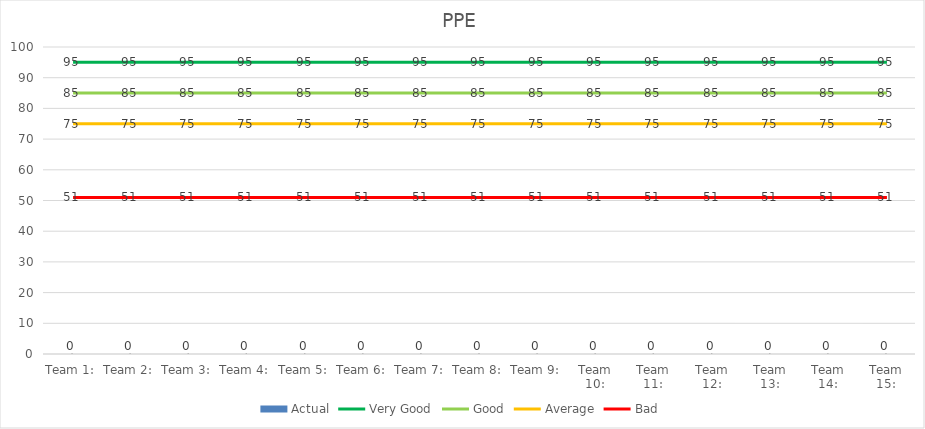
| Category | Actual |
|---|---|
| Team 1: | 0 |
| Team 2: | 0 |
| Team 3: | 0 |
| Team 4: | 0 |
| Team 5: | 0 |
| Team 6: | 0 |
| Team 7: | 0 |
| Team 8: | 0 |
| Team 9: | 0 |
| Team 10: | 0 |
| Team 11: | 0 |
| Team 12: | 0 |
| Team 13: | 0 |
| Team 14: | 0 |
| Team 15: | 0 |